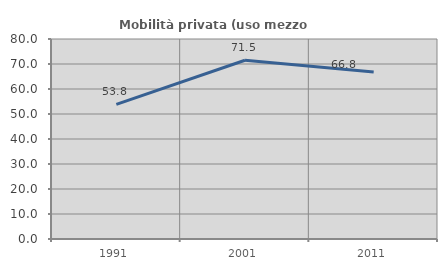
| Category | Mobilità privata (uso mezzo privato) |
|---|---|
| 1991.0 | 53.819 |
| 2001.0 | 71.493 |
| 2011.0 | 66.814 |